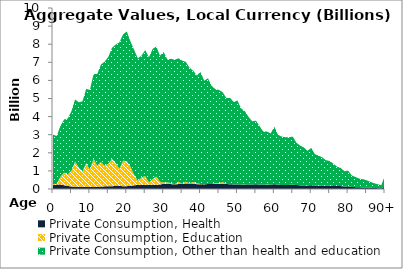
| Category | Private Consumption, Health | Private Consumption, Education | Private Consumption, Other than health and education |
|---|---|---|---|
| 0 | 212.535 | 63.241 | 2722.944 |
|  | 243.038 | 36.238 | 2649.441 |
| 2 | 248.446 | 418.551 | 2810.375 |
| 3 | 206.186 | 705.782 | 2929.557 |
| 4 | 166.468 | 634.369 | 3089.908 |
| 5 | 138.091 | 872.665 | 3298.309 |
| 6 | 124.555 | 1391.418 | 3429.767 |
| 7 | 126.41 | 1050.537 | 3612.61 |
| 8 | 122.029 | 852.114 | 3872.966 |
| 9 | 117.455 | 1310.957 | 4099.761 |
| 10 | 104.598 | 968.979 | 4407.327 |
| 11 | 110.897 | 1552.132 | 4691.731 |
| 12 | 116.349 | 1173.286 | 5063.114 |
| 13 | 135.308 | 1358.727 | 5386.173 |
| 14 | 145.245 | 1134.06 | 5753.815 |
| 15 | 149.876 | 1249.735 | 5902.499 |
| 16 | 154.013 | 1514.709 | 6136.304 |
| 17 | 167.399 | 1263.694 | 6548.231 |
| 18 | 166.655 | 962.036 | 6978.915 |
| 19 | 153.955 | 1413.725 | 6972.624 |
| 20 | 155.84 | 1382.696 | 7167.264 |
| 21 | 176.808 | 1045.779 | 6933.845 |
| 22 | 203.163 | 592.694 | 6891.721 |
| 23 | 223.427 | 209.832 | 6789.486 |
| 24 | 238.206 | 405.369 | 6728.021 |
| 25 | 226.425 | 488.732 | 6960.379 |
| 26 | 229.236 | 141.5 | 6902.103 |
| 27 | 241.28 | 309.075 | 7185.732 |
| 28 | 230.154 | 458.918 | 7182.915 |
| 29 | 249.084 | 156.587 | 6960.57 |
| 30 | 287.829 | 68.188 | 7208.037 |
| 31 | 273.477 | 96.038 | 6785.761 |
| 32 | 269.628 | 54.788 | 6871.078 |
| 33 | 266.522 | 1.502 | 6871.813 |
| 34 | 269.794 | 131.691 | 6820.746 |
| 35 | 285.558 | 9.13 | 6800.336 |
| 36 | 300.78 | 103.997 | 6622.323 |
| 37 | 306.898 | 11.613 | 6385.785 |
| 38 | 292.435 | 99.577 | 6147.799 |
| 39 | 266.828 | 56.719 | 5950.034 |
| 40 | 266.831 | 10.654 | 6185.019 |
| 41 | 251.444 | 8.18 | 5720.602 |
| 42 | 276.985 | 0.336 | 5843.718 |
| 43 | 275.943 | 0 | 5420.375 |
| 44 | 277.442 | 48.997 | 5188.901 |
| 45 | 285.409 | 45.542 | 5144.088 |
| 46 | 283.507 | 101.842 | 4964.638 |
| 47 | 271.714 | 13.826 | 4742.009 |
| 48 | 266.704 | 0 | 4762.695 |
| 49 | 248.427 | 0 | 4561.707 |
| 50 | 253.411 | 0 | 4632.088 |
| 51 | 236.175 | 0.397 | 4214.683 |
| 52 | 244.994 | 13.679 | 4044.702 |
| 53 | 246.447 | 0 | 3744.541 |
| 54 | 247.15 | 0 | 3493.804 |
| 55 | 259.967 | 0.144 | 3515.747 |
| 56 | 245.216 | 0 | 3231.693 |
| 57 | 228.218 | 1.255 | 2941.074 |
| 58 | 235.762 | 13.905 | 2929.526 |
| 59 | 234.075 | 0 | 2837.353 |
| 60 | 266.37 | 0 | 3172.653 |
| 61 | 232.187 | 0 | 2764.826 |
| 62 | 224.764 | 0 | 2673.585 |
| 63 | 223.424 | 0 | 2637.209 |
| 64 | 227.888 | 0 | 2634.575 |
| 65 | 238.104 | 0 | 2654.093 |
| 66 | 218.813 | 0 | 2333.653 |
| 67 | 200.918 | 0 | 2201.227 |
| 68 | 197.877 | 0 | 2099.079 |
| 69 | 189.933 | 0 | 1922.787 |
| 70 | 211.451 | 0 | 2059.115 |
| 71 | 185.596 | 0 | 1737.269 |
| 72 | 185.563 | 0 | 1663.38 |
| 73 | 182.918 | 0 | 1561.771 |
| 74 | 174.698 | 0 | 1415.48 |
| 75 | 179.253 | 0 | 1370.955 |
| 76 | 171.421 | 0 | 1229.664 |
| 77 | 161.125 | 0 | 1074.197 |
| 78 | 159.702 | 0 | 1002.201 |
| 79 | 139.208 | 0 | 839.218 |
| 80 | 148.354 | 0 | 870.274 |
| 81 | 112.932 | 0 | 638.24 |
| 82 | 101.814 | 0 | 560.975 |
| 83 | 90.687 | 0 | 485.343 |
| 84 | 87.54 | 0 | 453.454 |
| 85 | 81.119 | 0 | 405.728 |
| 86 | 68.332 | 0 | 330.549 |
| 87 | 56.791 | 0 | 266.253 |
| 88 | 47.615 | 0 | 216.848 |
| 89 | 38.855 | 0 | 172.392 |
| 90+ | 140.706 | 0 | 610.126 |